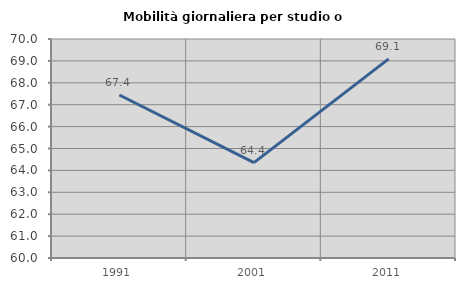
| Category | Mobilità giornaliera per studio o lavoro |
|---|---|
| 1991.0 | 67.444 |
| 2001.0 | 64.354 |
| 2011.0 | 69.092 |